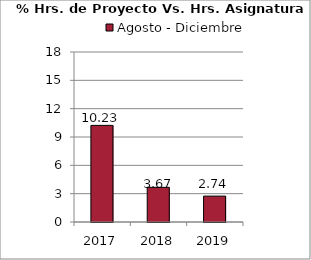
| Category | Agosto - Diciembre |
|---|---|
| 2017.0 | 10.23 |
| 2018.0 | 3.67 |
| 2019.0 | 2.74 |